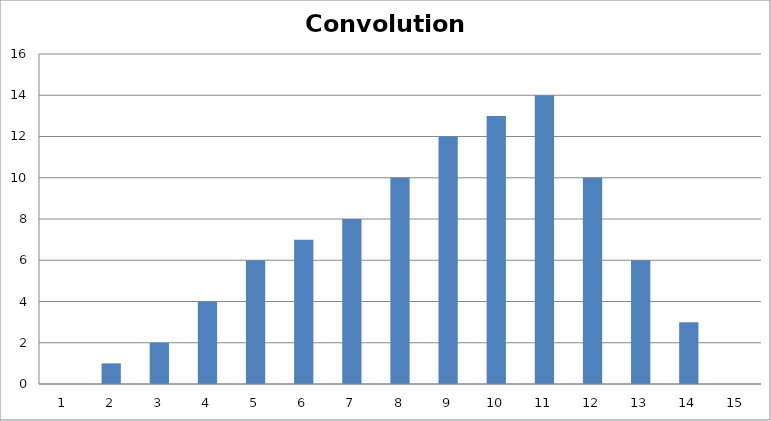
| Category | Convolution Summation |
|---|---|
| 0 | 0 |
| 1 | 1 |
| 2 | 2 |
| 3 | 4 |
| 4 | 6 |
| 5 | 7 |
| 6 | 8 |
| 7 | 10 |
| 8 | 12 |
| 9 | 13 |
| 10 | 14 |
| 11 | 10 |
| 12 | 6 |
| 13 | 3 |
| 14 | 0 |